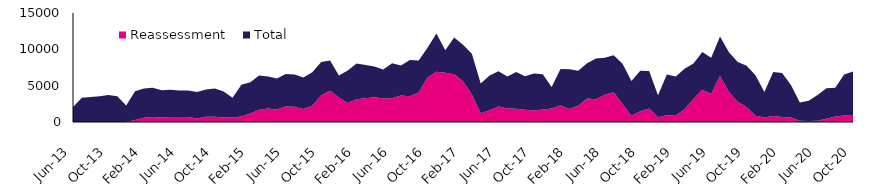
| Category | Reassessment | Total |
|---|---|---|
| 2013-06-01 | 0 | 2073 |
| 2013-07-01 | 6 | 3343 |
| 2013-08-01 | 6 | 3441 |
| 2013-09-01 | 13 | 3531 |
| 2013-10-01 | 12 | 3711 |
| 2013-11-01 | 11 | 3530 |
| 2013-12-01 | 6 | 2262 |
| 2014-01-01 | 288 | 3928 |
| 2014-02-01 | 578 | 4037 |
| 2014-03-01 | 700 | 4003 |
| 2014-04-01 | 612 | 3757 |
| 2014-05-01 | 691 | 3747 |
| 2014-06-01 | 689 | 3636 |
| 2014-07-01 | 686 | 3642 |
| 2014-08-01 | 470 | 3647 |
| 2014-09-01 | 714 | 3769 |
| 2014-10-01 | 725 | 3879 |
| 2014-11-01 | 636 | 3557 |
| 2014-12-01 | 629 | 2701 |
| 2015-01-01 | 761 | 4373 |
| 2015-02-01 | 1156 | 4328 |
| 2015-03-01 | 1698 | 4684 |
| 2015-04-01 | 1844 | 4406 |
| 2015-05-01 | 1731 | 4244 |
| 2015-06-01 | 2117 | 4485 |
| 2015-07-01 | 2084 | 4441 |
| 2015-08-01 | 1782 | 4335 |
| 2015-09-01 | 2235 | 4620 |
| 2015-10-01 | 3679 | 4593 |
| 2015-11-01 | 4295 | 4176 |
| 2015-12-01 | 3383 | 3030 |
| 2016-01-01 | 2629 | 4444 |
| 2016-02-01 | 3147 | 4897 |
| 2016-03-01 | 3280 | 4567 |
| 2016-04-01 | 3415 | 4234 |
| 2016-05-01 | 3250 | 3958 |
| 2016-06-01 | 3263 | 4826 |
| 2016-07-01 | 3632 | 4148 |
| 2016-08-01 | 3547 | 5000 |
| 2016-09-01 | 4062 | 4389 |
| 2016-10-01 | 6139 | 4066 |
| 2016-11-01 | 6921 | 5269 |
| 2016-12-01 | 6761 | 3107 |
| 2017-01-01 | 6572 | 5044 |
| 2017-02-01 | 5616 | 5012 |
| 2017-03-01 | 3776 | 5602 |
| 2017-04-01 | 1211 | 4084 |
| 2017-05-01 | 1614 | 4798 |
| 2017-06-01 | 2146 | 4838 |
| 2017-07-01 | 1872 | 4406 |
| 2017-08-01 | 1810 | 5058 |
| 2017-09-01 | 1672 | 4617 |
| 2017-10-01 | 1596 | 5067 |
| 2017-11-01 | 1709 | 4875 |
| 2017-12-01 | 1848 | 2960 |
| 2018-01-01 | 2270 | 5016 |
| 2018-02-01 | 1789 | 5461 |
| 2018-03-01 | 2252 | 4799 |
| 2018-04-01 | 3220 | 4878 |
| 2018-05-01 | 3128 | 5617 |
| 2018-06-01 | 3760 | 5071 |
| 2018-07-01 | 4080 | 5090 |
| 2018-08-01 | 2477 | 5523 |
| 2018-09-01 | 865 | 4791 |
| 2018-10-01 | 1466 | 5576 |
| 2018-11-01 | 1851 | 5176 |
| 2018-12-01 | 648 | 3031 |
| 2019-01-01 | 917 | 5614 |
| 2019-02-01 | 862 | 5398 |
| 2019-03-01 | 1764 | 5552 |
| 2019-04-01 | 3158 | 4904 |
| 2019-05-01 | 4425 | 5215 |
| 2019-06-01 | 3854 | 4984 |
| 2019-07-01 | 6326 | 5424 |
| 2019-08-01 | 4129 | 5478 |
| 2019-09-01 | 2769 | 5472 |
| 2019-10-01 | 2075 | 5652 |
| 2019-11-01 | 876 | 5569 |
| 2019-12-01 | 614 | 3528 |
| 2020-01-01 | 836 | 6037 |
| 2020-02-01 | 700 | 6035 |
| 2020-03-01 | 607 | 4468 |
| 2020-04-01 | 171 | 2525 |
| 2020-05-01 | 145 | 2781 |
| 2020-06-01 | 159 | 3561 |
| 2020-07-01 | 432 | 4221 |
| 2020-08-01 | 748 | 3982 |
| 2020-09-01 | 884 | 5653 |
| 2020-10-01 | 862 | 6077 |